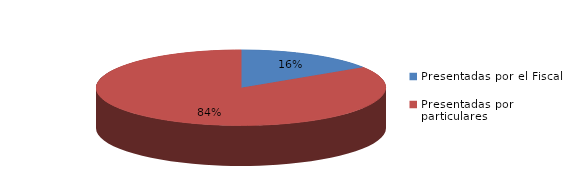
| Category | Series 0 |
|---|---|
| Presentadas por el Fiscal | 28 |
| Presentadas por particulares | 148 |